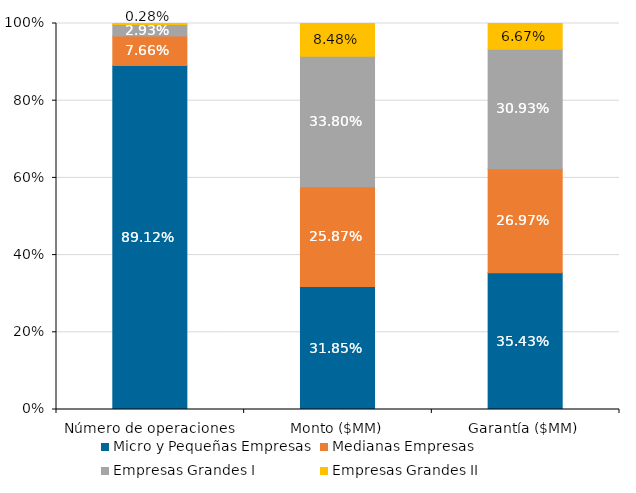
| Category | Micro y Pequeñas Empresas | Medianas Empresas | Empresas Grandes I | Empresas Grandes II |
|---|---|---|---|---|
| Número de operaciones | 0.891 | 0.077 | 0.029 | 0.003 |
| Monto ($MM) | 0.319 | 0.259 | 0.338 | 0.085 |
| Garantía ($MM) | 0.354 | 0.27 | 0.309 | 0.067 |